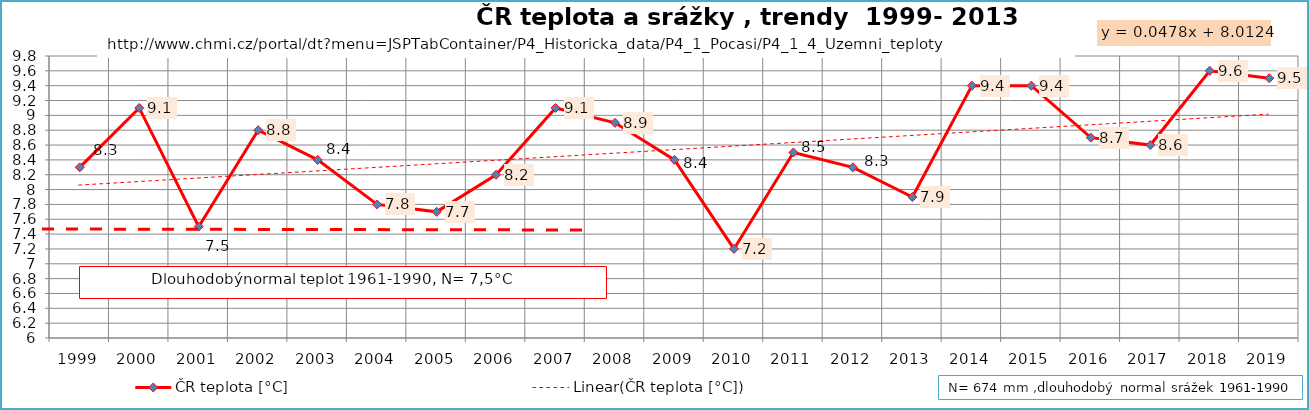
| Category | ČR teplota [°C] |
|---|---|
| 1999.0 | 8.3 |
| 2000.0 | 9.1 |
| 2001.0 | 7.5 |
| 2002.0 | 8.8 |
| 2003.0 | 8.4 |
| 2004.0 | 7.8 |
| 2005.0 | 7.7 |
| 2006.0 | 8.2 |
| 2007.0 | 9.1 |
| 2008.0 | 8.9 |
| 2009.0 | 8.4 |
| 2010.0 | 7.2 |
| 2011.0 | 8.5 |
| 2012.0 | 8.3 |
| 2013.0 | 7.9 |
| 2014.0 | 9.4 |
| 2015.0 | 9.4 |
| 2016.0 | 8.7 |
| 2017.0 | 8.6 |
| 2018.0 | 9.6 |
| 2019.0 | 9.5 |